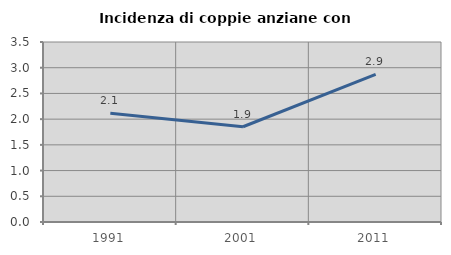
| Category | Incidenza di coppie anziane con figli |
|---|---|
| 1991.0 | 2.114 |
| 2001.0 | 1.852 |
| 2011.0 | 2.871 |